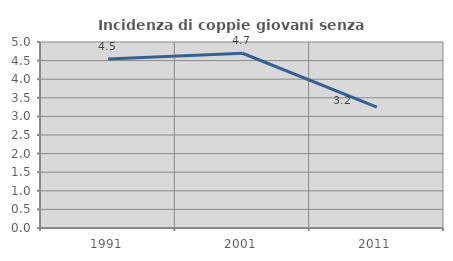
| Category | Incidenza di coppie giovani senza figli |
|---|---|
| 1991.0 | 4.545 |
| 2001.0 | 4.698 |
| 2011.0 | 3.247 |